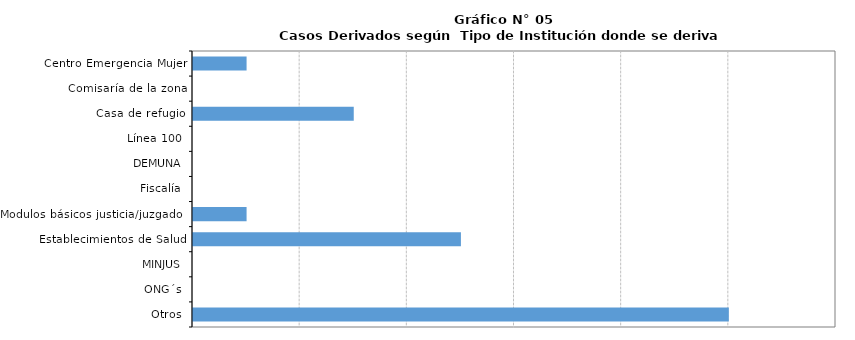
| Category | Series 0 |
|---|---|
| Centro Emergencia Mujer | 1 |
| Comisaría de la zona | 0 |
| Casa de refugio | 3 |
| Línea 100 | 0 |
| DEMUNA | 0 |
| Fiscalía | 0 |
| Modulos básicos justicia/juzgados | 1 |
| Establecimientos de Salud | 5 |
| MINJUS | 0 |
| ONG´s | 0 |
| Otros | 10 |